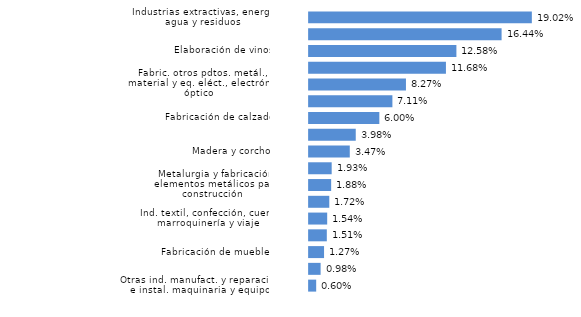
| Category | La Rioja |
|---|---|
| Otras ind. manufact. y reparación e instal. maquinaria y equipo | 0.006 |
| Forja y talleres | 0.01 |
| Fabricación de muebles | 0.013 |
| Productos minerales no metálicos diversos | 0.015 |
| Ind. textil, confección, cuero, marroquinería y viaje | 0.015 |
| Papel, artes gráficas y reproducción soportes grabados | 0.017 |
| Metalurgia y fabricación elementos metálicos para construcción | 0.019 |
| Industria química y farmacéutica | 0.019 |
| Madera y corcho | 0.035 |
| Fabricación de maquinaria, equipo y material de transporte | 0.04 |
| Fabricación de calzado | 0.06 |
| Caucho y materias plásticas | 0.071 |
| Fabric. otros pdtos. metál., material y eq. eléct., electrón. y óptico | 0.083 |
| Otras ind. alimenticias, bebidas (exto. elaborac. vinos) y tabaco | 0.117 |
| Elaboración de vinos | 0.126 |
| Ind. cárnica, frutas, hortal., aceit. y grasas veget. y anim. e ind. láctea | 0.164 |
| Industrias extractivas, energía, agua y residuos | 0.19 |